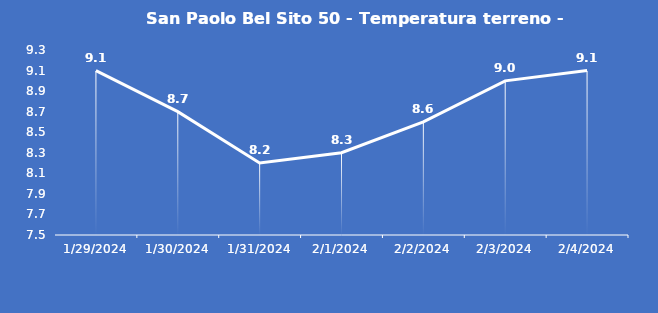
| Category | San Paolo Bel Sito 50 - Temperatura terreno - Grezzo (°C) |
|---|---|
| 1/29/24 | 9.1 |
| 1/30/24 | 8.7 |
| 1/31/24 | 8.2 |
| 2/1/24 | 8.3 |
| 2/2/24 | 8.6 |
| 2/3/24 | 9 |
| 2/4/24 | 9.1 |